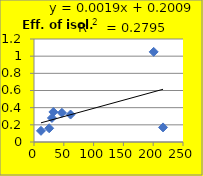
| Category | Eff. of isol. (µg/g) |
|---|---|
| 25.5 | 0.16 |
| 61.3 | 0.32 |
| 11.7 | 0.13 |
| 216.5 | 0.17 |
| 46.8 | 0.34 |
| 32.5 | 0.35 |
| 200.8 | 1.05 |
| 30.1 | 0.28 |